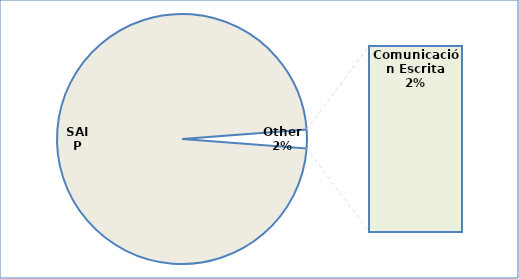
| Category | Series 0 |
|---|---|
| SAIP | 0.975 |
| Correo Electrónico | 0 |
| Comunicación Escrita | 0.024 |